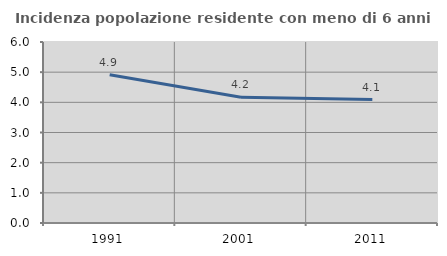
| Category | Incidenza popolazione residente con meno di 6 anni |
|---|---|
| 1991.0 | 4.915 |
| 2001.0 | 4.172 |
| 2011.0 | 4.094 |